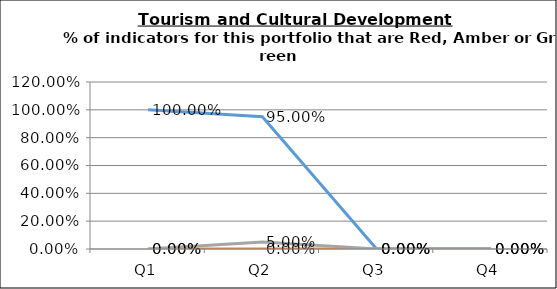
| Category | Green | Amber | Red |
|---|---|---|---|
| Q1 | 1 | 0 | 0 |
| Q2 | 0.95 | 0 | 0.05 |
| Q3 | 0 | 0 | 0 |
| Q4 | 0 | 0 | 0 |